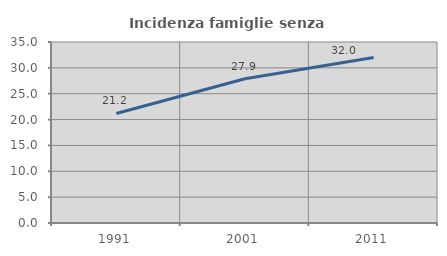
| Category | Incidenza famiglie senza nuclei |
|---|---|
| 1991.0 | 21.185 |
| 2001.0 | 27.883 |
| 2011.0 | 32 |